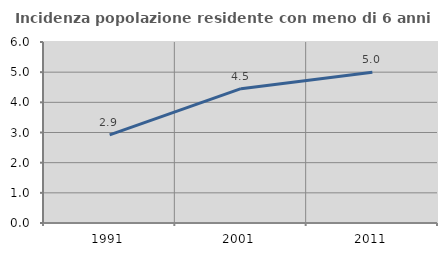
| Category | Incidenza popolazione residente con meno di 6 anni |
|---|---|
| 1991.0 | 2.921 |
| 2001.0 | 4.453 |
| 2011.0 | 5 |